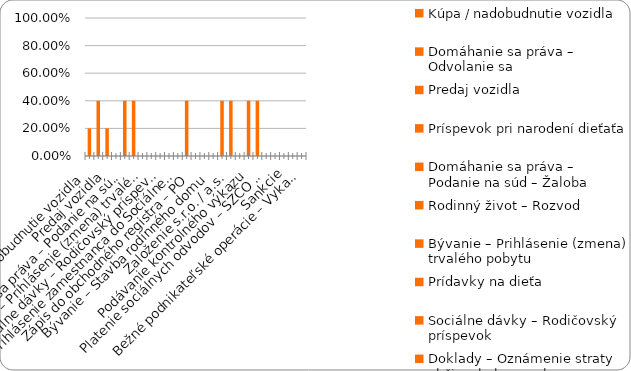
| Category | % |
|---|---|
| Kúpa / nadobudnutie vozidla | 0.2 |
| Domáhanie sa práva – Odvolanie sa | 0.4 |
| Predaj vozidla | 0.2 |
| Príspevok pri narodení dieťaťa | 0 |
| Domáhanie sa práva – Podanie na súd – Žaloba | 0.4 |
| Rodinný život – Rozvod | 0.4 |
| Bývanie – Prihlásenie (zmena) trvalého pobytu | 0 |
| Prídavky na dieťa | 0 |
| Sociálne dávky – Rodičovský príspevok | 0 |
| Doklady – Oznámenie straty občianskeho preukazu | 0 |
| Prihlásenie zamestnanca do Sociálnej poisťovne | 0 |
| Plnenie si daňových povinností – zamestnanec (FO) | 0.4 |
| Zápis do obchodného registra – PO | 0 |
| Živnosť - ukončenie | 0 |
| Bývanie – Stavba rodinného domu | 0 |
| Sociálne dávky – Príspevok v nezamestnanosti | 0.4 |
| Založenie s.r.o. / a.s. | 0.4 |
| Živnosť – založenie | 0 |
| Podávanie kontrolného výkazu | 0.4 |
| Plnenie si daňových povinností – SZČO / PO  | 0.4 |
| Platenie sociálnych odvodov – SZČO / PO | 0 |
| Živnosť - prerušenie | 0 |
| Sankcie | 0 |
| Živnosť - zmena | 0 |
| Bežné podnikateľské operácie – Vykazovanie štatistík | 0 |